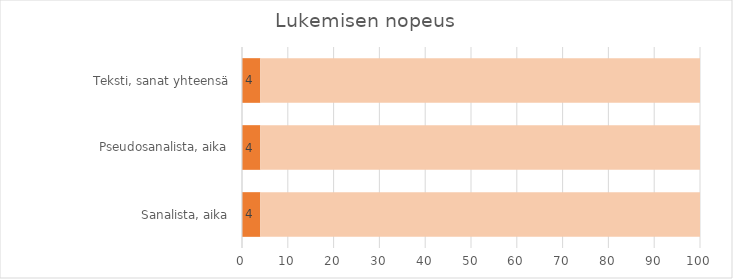
| Category | Series 0 | 96 |
|---|---|---|
| Sanalista, aika | 4 | 96 |
| Pseudosanalista, aika | 4 | 96 |
| Teksti, sanat yhteensä | 4 | 96 |